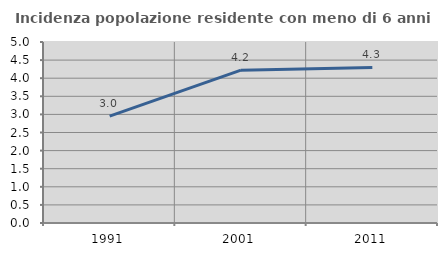
| Category | Incidenza popolazione residente con meno di 6 anni |
|---|---|
| 1991.0 | 2.954 |
| 2001.0 | 4.221 |
| 2011.0 | 4.296 |